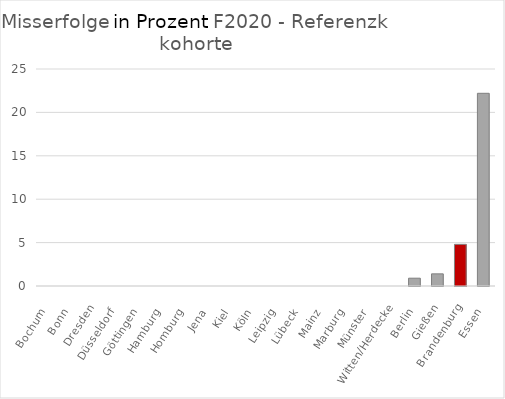
| Category | Misserfolg Ref |
|---|---|
| Bochum | 0 |
| Bonn | 0 |
| Dresden | 0 |
| Düsseldorf | 0 |
| Göttingen | 0 |
| Hamburg | 0 |
| Homburg | 0 |
| Jena | 0 |
| Kiel | 0 |
| Köln | 0 |
| Leipzig | 0 |
| Lübeck | 0 |
| Mainz | 0 |
| Marburg | 0 |
| Münster | 0 |
| Witten/Herdecke | 0 |
| Berlin | 0.9 |
| Gießen | 1.4 |
| Brandenburg | 4.8 |
| Essen | 22.2 |